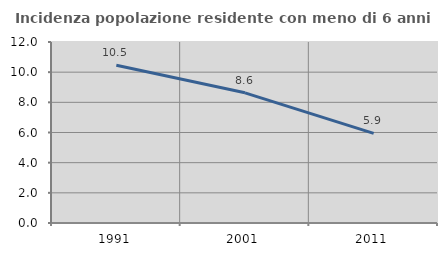
| Category | Incidenza popolazione residente con meno di 6 anni |
|---|---|
| 1991.0 | 10.454 |
| 2001.0 | 8.63 |
| 2011.0 | 5.942 |